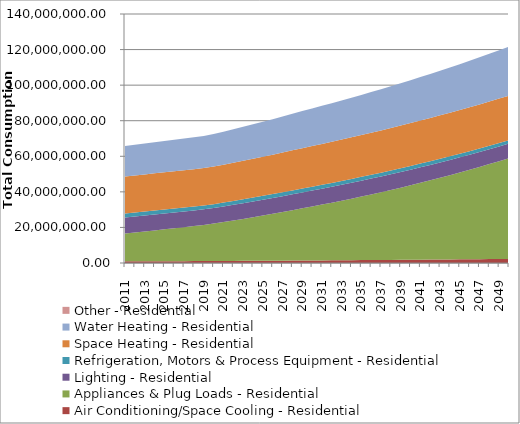
| Category | Air Conditioning/Space Cooling - Residential | Appliances & Plug Loads - Residential | Lighting - Residential | Refrigeration, Motors & Process Equipment - Residential | Space Heating - Residential | Water Heating - Residential | Other - Residential |
|---|---|---|---|---|---|---|---|
| 2011.0 | 937875.49 | 15636182.406 | 8997915.949 | 2292935.775 | 20834767.919 | 17117355.046 | 0 |
| 2012.0 | 955572.822 | 16187256.877 | 8972143.182 | 2283432.89 | 20860087.637 | 17235290.289 | 0 |
| 2013.0 | 973533.614 | 16747947.036 | 8944908.341 | 2273497.541 | 20883755.961 | 17353850.44 | 0 |
| 2014.0 | 991761.4 | 17318391.714 | 8916184.346 | 2263121.896 | 20905736.566 | 17473035.977 | 0 |
| 2015.0 | 1010259.758 | 17898731.576 | 8885943.514 | 2252298.005 | 20925992.558 | 17592847.323 | 0 |
| 2016.0 | 1029032.312 | 18489109.14 | 8854158.027 | 2241017.734 | 20944486.396 | 17713284.842 | 0 |
| 2017.0 | 1048082.73 | 19089668.802 | 8820799.378 | 2229273.038 | 20961180.16 | 17834348.843 | 0 |
| 2018.0 | 1067414.729 | 19700556.861 | 8785838.92 | 2217055.545 | 20976035.133 | 17956039.574 | 0 |
| 2019.0 | 1087032.07 | 20321921.61 | 8749247.304 | 2204356.832 | 20989012.063 | 18078357.225 | 0 |
| 2020.0 | 1111601.359 | 21042177.969 | 8747688.658 | 2200398.287 | 21088530.339 | 18277971.82 | 0 |
| 2021.0 | 1141073.572 | 21863698.072 | 8778258.042 | 2204403.13 | 21268922.436 | 18551436.62 | 0 |
| 2022.0 | 1171254.108 | 22708326.658 | 8806990.587 | 2207810.337 | 21448812.951 | 18828776.65 | 0 |
| 2023.0 | 1202158.977 | 23576635.995 | 8833808.422 | 2210596.556 | 21628122.348 | 19110041.933 | 0 |
| 2024.0 | 1233804.618 | 24469211.587 | 8858631.199 | 2212737.781 | 21806768.253 | 19395283.02 | 0 |
| 2025.0 | 1266207.829 | 25386652.471 | 8881376.576 | 2214209.252 | 21984665.697 | 19684550.995 | 0 |
| 2026.0 | 1299385.774 | 26329571.509 | 8901959.534 | 2214985.757 | 22161726.567 | 19977897.473 | 0 |
| 2027.0 | 1333355.993 | 27298595.7 | 8920292.958 | 2215041.141 | 22337859.844 | 20275374.608 | 0 |
| 2028.0 | 1368136.41 | 28294366.491 | 8936286.926 | 2214348.604 | 22512971.357 | 20577035.091 | 0 |
| 2029.0 | 1403745.338 | 29317540.096 | 8949849.304 | 2212880.601 | 22686964.038 | 20882932.153 | 0 |
| 2030.0 | 1438023.352 | 30322858.478 | 8947332.697 | 2207265.534 | 22825164.577 | 21161067.293 | 0 |
| 2031.0 | 1473058.202 | 31353742.868 | 8942187.099 | 2200832.056 | 22961576.03 | 21442644.997 | 0 |
| 2032.0 | 1508865.665 | 32410769.588 | 8934324.394 | 2193554.164 | 23096098.778 | 21727702.197 | 0 |
| 2033.0 | 1545461.835 | 33494527.127 | 8923654.512 | 2185405.215 | 23228630.263 | 22016276.178 | 0 |
| 2034.0 | 1582863.034 | 34605616.387 | 8910085.121 | 2176357.809 | 23359065.282 | 22308404.496 | 0 |
| 2035.0 | 1621086.195 | 35744650.933 | 8893521.291 | 2166384.155 | 23487295.372 | 22604124.97 | 0 |
| 2036.0 | 1660148.308 | 36912257.25 | 8873866.097 | 2155455.497 | 23613209.1 | 22903475.688 | 0 |
| 2037.0 | 1700066.796 | 38109075.006 | 8851019.808 | 2143542.466 | 23736691.805 | 23206494.998 | 0 |
| 2038.0 | 1740859.434 | 39335757.315 | 8824880.604 | 2130614.975 | 23857625.917 | 23513221.51 | 0 |
| 2039.0 | 1782544.35 | 40592971.013 | 8795343.738 | 2116642.202 | 23975890.29 | 23823694.095 | 0 |
| 2040.0 | 1825140.036 | 41881396.93 | 8762302.272 | 2101592.573 | 24091360.52 | 24137951.775 | 0 |
| 2041.0 | 1868665.356 | 43201730.176 | 8725646.218 | 2085433.749 | 24203908.662 | 24456034.135 | 0 |
| 2042.0 | 1913139.546 | 44554680.429 | 8685263.185 | 2068132.605 | 24313403.566 | 24777980.708 | 0 |
| 2043.0 | 1958582.233 | 45940972.225 | 8641038.025 | 2049655.105 | 24419710.174 | 25103831.374 | 0 |
| 2044.0 | 2005013.43 | 47361345.263 | 8592852.44 | 2029966.72 | 24522689.846 | 25433626.263 | 0 |
| 2045.0 | 2052453.554 | 48816554.705 | 8540585.675 | 2009031.758 | 24622200.063 | 25767405.744 | 0 |
| 2046.0 | 2100923.427 | 50307371.489 | 8484113.581 | 1986813.782 | 24718094.783 | 26105210.432 | 0 |
| 2047.0 | 2150444.287 | 51834582.648 | 8423309.438 | 1963275.479 | 24810223.686 | 26447081.172 | 0 |
| 2048.0 | 2201037.677 | 53398991.631 | 8358042.985 | 1938378.641 | 24898432.524 | 26793059.049 | 0 |
| 2049.0 | 2252725.926 | 55001418.636 | 8288181.272 | 1912084.149 | 24982562.92 | 27143185.371 | 0 |
| 2050.0 | 2305531.449 | 56642700.941 | 8213587.654 | 1884351.95 | 25062452.147 | 27497501.677 | 0 |